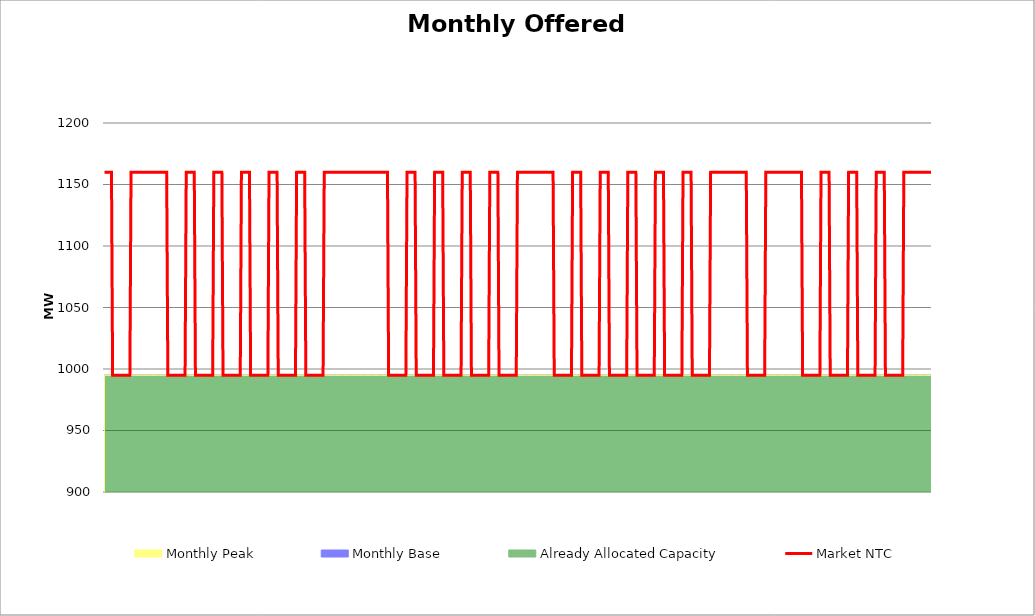
| Category | Market NTC |
|---|---|
| 0 | 1160 |
| 1 | 1160 |
| 2 | 1160 |
| 3 | 1160 |
| 4 | 1160 |
| 5 | 1160 |
| 6 | 1160 |
| 7 | 995 |
| 8 | 995 |
| 9 | 995 |
| 10 | 995 |
| 11 | 995 |
| 12 | 995 |
| 13 | 995 |
| 14 | 995 |
| 15 | 995 |
| 16 | 995 |
| 17 | 995 |
| 18 | 995 |
| 19 | 995 |
| 20 | 995 |
| 21 | 995 |
| 22 | 995 |
| 23 | 1160 |
| 24 | 1160 |
| 25 | 1160 |
| 26 | 1160 |
| 27 | 1160 |
| 28 | 1160 |
| 29 | 1160 |
| 30 | 1160 |
| 31 | 1160 |
| 32 | 1160 |
| 33 | 1160 |
| 34 | 1160 |
| 35 | 1160 |
| 36 | 1160 |
| 37 | 1160 |
| 38 | 1160 |
| 39 | 1160 |
| 40 | 1160 |
| 41 | 1160 |
| 42 | 1160 |
| 43 | 1160 |
| 44 | 1160 |
| 45 | 1160 |
| 46 | 1160 |
| 47 | 1160 |
| 48 | 1160 |
| 49 | 1160 |
| 50 | 1160 |
| 51 | 1160 |
| 52 | 1160 |
| 53 | 1160 |
| 54 | 1160 |
| 55 | 995 |
| 56 | 995 |
| 57 | 995 |
| 58 | 995 |
| 59 | 995 |
| 60 | 995 |
| 61 | 995 |
| 62 | 995 |
| 63 | 995 |
| 64 | 995 |
| 65 | 995 |
| 66 | 995 |
| 67 | 995 |
| 68 | 995 |
| 69 | 995 |
| 70 | 995 |
| 71 | 1160 |
| 72 | 1160 |
| 73 | 1160 |
| 74 | 1160 |
| 75 | 1160 |
| 76 | 1160 |
| 77 | 1160 |
| 78 | 1160 |
| 79 | 995 |
| 80 | 995 |
| 81 | 995 |
| 82 | 995 |
| 83 | 995 |
| 84 | 995 |
| 85 | 995 |
| 86 | 995 |
| 87 | 995 |
| 88 | 995 |
| 89 | 995 |
| 90 | 995 |
| 91 | 995 |
| 92 | 995 |
| 93 | 995 |
| 94 | 995 |
| 95 | 1160 |
| 96 | 1160 |
| 97 | 1160 |
| 98 | 1160 |
| 99 | 1160 |
| 100 | 1160 |
| 101 | 1160 |
| 102 | 1160 |
| 103 | 995 |
| 104 | 995 |
| 105 | 995 |
| 106 | 995 |
| 107 | 995 |
| 108 | 995 |
| 109 | 995 |
| 110 | 995 |
| 111 | 995 |
| 112 | 995 |
| 113 | 995 |
| 114 | 995 |
| 115 | 995 |
| 116 | 995 |
| 117 | 995 |
| 118 | 995 |
| 119 | 1160 |
| 120 | 1160 |
| 121 | 1160 |
| 122 | 1160 |
| 123 | 1160 |
| 124 | 1160 |
| 125 | 1160 |
| 126 | 1160 |
| 127 | 995 |
| 128 | 995 |
| 129 | 995 |
| 130 | 995 |
| 131 | 995 |
| 132 | 995 |
| 133 | 995 |
| 134 | 995 |
| 135 | 995 |
| 136 | 995 |
| 137 | 995 |
| 138 | 995 |
| 139 | 995 |
| 140 | 995 |
| 141 | 995 |
| 142 | 995 |
| 143 | 1160 |
| 144 | 1160 |
| 145 | 1160 |
| 146 | 1160 |
| 147 | 1160 |
| 148 | 1160 |
| 149 | 1160 |
| 150 | 1160 |
| 151 | 995 |
| 152 | 995 |
| 153 | 995 |
| 154 | 995 |
| 155 | 995 |
| 156 | 995 |
| 157 | 995 |
| 158 | 995 |
| 159 | 995 |
| 160 | 995 |
| 161 | 995 |
| 162 | 995 |
| 163 | 995 |
| 164 | 995 |
| 165 | 995 |
| 166 | 995 |
| 167 | 1160 |
| 168 | 1160 |
| 169 | 1160 |
| 170 | 1160 |
| 171 | 1160 |
| 172 | 1160 |
| 173 | 1160 |
| 174 | 1160 |
| 175 | 995 |
| 176 | 995 |
| 177 | 995 |
| 178 | 995 |
| 179 | 995 |
| 180 | 995 |
| 181 | 995 |
| 182 | 995 |
| 183 | 995 |
| 184 | 995 |
| 185 | 995 |
| 186 | 995 |
| 187 | 995 |
| 188 | 995 |
| 189 | 995 |
| 190 | 995 |
| 191 | 1160 |
| 192 | 1160 |
| 193 | 1160 |
| 194 | 1160 |
| 195 | 1160 |
| 196 | 1160 |
| 197 | 1160 |
| 198 | 1160 |
| 199 | 1160 |
| 200 | 1160 |
| 201 | 1160 |
| 202 | 1160 |
| 203 | 1160 |
| 204 | 1160 |
| 205 | 1160 |
| 206 | 1160 |
| 207 | 1160 |
| 208 | 1160 |
| 209 | 1160 |
| 210 | 1160 |
| 211 | 1160 |
| 212 | 1160 |
| 213 | 1160 |
| 214 | 1160 |
| 215 | 1160 |
| 216 | 1160 |
| 217 | 1160 |
| 218 | 1160 |
| 219 | 1160 |
| 220 | 1160 |
| 221 | 1160 |
| 222 | 1160 |
| 223 | 1160 |
| 224 | 1160 |
| 225 | 1160 |
| 226 | 1160 |
| 227 | 1160 |
| 228 | 1160 |
| 229 | 1160 |
| 230 | 1160 |
| 231 | 1160 |
| 232 | 1160 |
| 233 | 1160 |
| 234 | 1160 |
| 235 | 1160 |
| 236 | 1160 |
| 237 | 1160 |
| 238 | 1160 |
| 239 | 1160 |
| 240 | 1160 |
| 241 | 1160 |
| 242 | 1160 |
| 243 | 1160 |
| 244 | 1160 |
| 245 | 1160 |
| 246 | 1160 |
| 247 | 995 |
| 248 | 995 |
| 249 | 995 |
| 250 | 995 |
| 251 | 995 |
| 252 | 995 |
| 253 | 995 |
| 254 | 995 |
| 255 | 995 |
| 256 | 995 |
| 257 | 995 |
| 258 | 995 |
| 259 | 995 |
| 260 | 995 |
| 261 | 995 |
| 262 | 995 |
| 263 | 1160 |
| 264 | 1160 |
| 265 | 1160 |
| 266 | 1160 |
| 267 | 1160 |
| 268 | 1160 |
| 269 | 1160 |
| 270 | 1160 |
| 271 | 995 |
| 272 | 995 |
| 273 | 995 |
| 274 | 995 |
| 275 | 995 |
| 276 | 995 |
| 277 | 995 |
| 278 | 995 |
| 279 | 995 |
| 280 | 995 |
| 281 | 995 |
| 282 | 995 |
| 283 | 995 |
| 284 | 995 |
| 285 | 995 |
| 286 | 995 |
| 287 | 1160 |
| 288 | 1160 |
| 289 | 1160 |
| 290 | 1160 |
| 291 | 1160 |
| 292 | 1160 |
| 293 | 1160 |
| 294 | 1160 |
| 295 | 995 |
| 296 | 995 |
| 297 | 995 |
| 298 | 995 |
| 299 | 995 |
| 300 | 995 |
| 301 | 995 |
| 302 | 995 |
| 303 | 995 |
| 304 | 995 |
| 305 | 995 |
| 306 | 995 |
| 307 | 995 |
| 308 | 995 |
| 309 | 995 |
| 310 | 995 |
| 311 | 1160 |
| 312 | 1160 |
| 313 | 1160 |
| 314 | 1160 |
| 315 | 1160 |
| 316 | 1160 |
| 317 | 1160 |
| 318 | 1160 |
| 319 | 995 |
| 320 | 995 |
| 321 | 995 |
| 322 | 995 |
| 323 | 995 |
| 324 | 995 |
| 325 | 995 |
| 326 | 995 |
| 327 | 995 |
| 328 | 995 |
| 329 | 995 |
| 330 | 995 |
| 331 | 995 |
| 332 | 995 |
| 333 | 995 |
| 334 | 995 |
| 335 | 1160 |
| 336 | 1160 |
| 337 | 1160 |
| 338 | 1160 |
| 339 | 1160 |
| 340 | 1160 |
| 341 | 1160 |
| 342 | 1160 |
| 343 | 995 |
| 344 | 995 |
| 345 | 995 |
| 346 | 995 |
| 347 | 995 |
| 348 | 995 |
| 349 | 995 |
| 350 | 995 |
| 351 | 995 |
| 352 | 995 |
| 353 | 995 |
| 354 | 995 |
| 355 | 995 |
| 356 | 995 |
| 357 | 995 |
| 358 | 995 |
| 359 | 1160 |
| 360 | 1160 |
| 361 | 1160 |
| 362 | 1160 |
| 363 | 1160 |
| 364 | 1160 |
| 365 | 1160 |
| 366 | 1160 |
| 367 | 1160 |
| 368 | 1160 |
| 369 | 1160 |
| 370 | 1160 |
| 371 | 1160 |
| 372 | 1160 |
| 373 | 1160 |
| 374 | 1160 |
| 375 | 1160 |
| 376 | 1160 |
| 377 | 1160 |
| 378 | 1160 |
| 379 | 1160 |
| 380 | 1160 |
| 381 | 1160 |
| 382 | 1160 |
| 383 | 1160 |
| 384 | 1160 |
| 385 | 1160 |
| 386 | 1160 |
| 387 | 1160 |
| 388 | 1160 |
| 389 | 1160 |
| 390 | 1160 |
| 391 | 995 |
| 392 | 995 |
| 393 | 995 |
| 394 | 995 |
| 395 | 995 |
| 396 | 995 |
| 397 | 995 |
| 398 | 995 |
| 399 | 995 |
| 400 | 995 |
| 401 | 995 |
| 402 | 995 |
| 403 | 995 |
| 404 | 995 |
| 405 | 995 |
| 406 | 995 |
| 407 | 1160 |
| 408 | 1160 |
| 409 | 1160 |
| 410 | 1160 |
| 411 | 1160 |
| 412 | 1160 |
| 413 | 1160 |
| 414 | 1160 |
| 415 | 995 |
| 416 | 995 |
| 417 | 995 |
| 418 | 995 |
| 419 | 995 |
| 420 | 995 |
| 421 | 995 |
| 422 | 995 |
| 423 | 995 |
| 424 | 995 |
| 425 | 995 |
| 426 | 995 |
| 427 | 995 |
| 428 | 995 |
| 429 | 995 |
| 430 | 995 |
| 431 | 1160 |
| 432 | 1160 |
| 433 | 1160 |
| 434 | 1160 |
| 435 | 1160 |
| 436 | 1160 |
| 437 | 1160 |
| 438 | 1160 |
| 439 | 995 |
| 440 | 995 |
| 441 | 995 |
| 442 | 995 |
| 443 | 995 |
| 444 | 995 |
| 445 | 995 |
| 446 | 995 |
| 447 | 995 |
| 448 | 995 |
| 449 | 995 |
| 450 | 995 |
| 451 | 995 |
| 452 | 995 |
| 453 | 995 |
| 454 | 995 |
| 455 | 1160 |
| 456 | 1160 |
| 457 | 1160 |
| 458 | 1160 |
| 459 | 1160 |
| 460 | 1160 |
| 461 | 1160 |
| 462 | 1160 |
| 463 | 995 |
| 464 | 995 |
| 465 | 995 |
| 466 | 995 |
| 467 | 995 |
| 468 | 995 |
| 469 | 995 |
| 470 | 995 |
| 471 | 995 |
| 472 | 995 |
| 473 | 995 |
| 474 | 995 |
| 475 | 995 |
| 476 | 995 |
| 477 | 995 |
| 478 | 995 |
| 479 | 1160 |
| 480 | 1160 |
| 481 | 1160 |
| 482 | 1160 |
| 483 | 1160 |
| 484 | 1160 |
| 485 | 1160 |
| 486 | 1160 |
| 487 | 995 |
| 488 | 995 |
| 489 | 995 |
| 490 | 995 |
| 491 | 995 |
| 492 | 995 |
| 493 | 995 |
| 494 | 995 |
| 495 | 995 |
| 496 | 995 |
| 497 | 995 |
| 498 | 995 |
| 499 | 995 |
| 500 | 995 |
| 501 | 995 |
| 502 | 995 |
| 503 | 1160 |
| 504 | 1160 |
| 505 | 1160 |
| 506 | 1160 |
| 507 | 1160 |
| 508 | 1160 |
| 509 | 1160 |
| 510 | 1160 |
| 511 | 995 |
| 512 | 995 |
| 513 | 995 |
| 514 | 995 |
| 515 | 995 |
| 516 | 995 |
| 517 | 995 |
| 518 | 995 |
| 519 | 995 |
| 520 | 995 |
| 521 | 995 |
| 522 | 995 |
| 523 | 995 |
| 524 | 995 |
| 525 | 995 |
| 526 | 995 |
| 527 | 1160 |
| 528 | 1160 |
| 529 | 1160 |
| 530 | 1160 |
| 531 | 1160 |
| 532 | 1160 |
| 533 | 1160 |
| 534 | 1160 |
| 535 | 1160 |
| 536 | 1160 |
| 537 | 1160 |
| 538 | 1160 |
| 539 | 1160 |
| 540 | 1160 |
| 541 | 1160 |
| 542 | 1160 |
| 543 | 1160 |
| 544 | 1160 |
| 545 | 1160 |
| 546 | 1160 |
| 547 | 1160 |
| 548 | 1160 |
| 549 | 1160 |
| 550 | 1160 |
| 551 | 1160 |
| 552 | 1160 |
| 553 | 1160 |
| 554 | 1160 |
| 555 | 1160 |
| 556 | 1160 |
| 557 | 1160 |
| 558 | 1160 |
| 559 | 995 |
| 560 | 995 |
| 561 | 995 |
| 562 | 995 |
| 563 | 995 |
| 564 | 995 |
| 565 | 995 |
| 566 | 995 |
| 567 | 995 |
| 568 | 995 |
| 569 | 995 |
| 570 | 995 |
| 571 | 995 |
| 572 | 995 |
| 573 | 995 |
| 574 | 995 |
| 575 | 1160 |
| 576 | 1160 |
| 577 | 1160 |
| 578 | 1160 |
| 579 | 1160 |
| 580 | 1160 |
| 581 | 1160 |
| 582 | 1160 |
| 583 | 1160 |
| 584 | 1160 |
| 585 | 1160 |
| 586 | 1160 |
| 587 | 1160 |
| 588 | 1160 |
| 589 | 1160 |
| 590 | 1160 |
| 591 | 1160 |
| 592 | 1160 |
| 593 | 1160 |
| 594 | 1160 |
| 595 | 1160 |
| 596 | 1160 |
| 597 | 1160 |
| 598 | 1160 |
| 599 | 1160 |
| 600 | 1160 |
| 601 | 1160 |
| 602 | 1160 |
| 603 | 1160 |
| 604 | 1160 |
| 605 | 1160 |
| 606 | 1160 |
| 607 | 995 |
| 608 | 995 |
| 609 | 995 |
| 610 | 995 |
| 611 | 995 |
| 612 | 995 |
| 613 | 995 |
| 614 | 995 |
| 615 | 995 |
| 616 | 995 |
| 617 | 995 |
| 618 | 995 |
| 619 | 995 |
| 620 | 995 |
| 621 | 995 |
| 622 | 995 |
| 623 | 1160 |
| 624 | 1160 |
| 625 | 1160 |
| 626 | 1160 |
| 627 | 1160 |
| 628 | 1160 |
| 629 | 1160 |
| 630 | 1160 |
| 631 | 995 |
| 632 | 995 |
| 633 | 995 |
| 634 | 995 |
| 635 | 995 |
| 636 | 995 |
| 637 | 995 |
| 638 | 995 |
| 639 | 995 |
| 640 | 995 |
| 641 | 995 |
| 642 | 995 |
| 643 | 995 |
| 644 | 995 |
| 645 | 995 |
| 646 | 995 |
| 647 | 1160 |
| 648 | 1160 |
| 649 | 1160 |
| 650 | 1160 |
| 651 | 1160 |
| 652 | 1160 |
| 653 | 1160 |
| 654 | 1160 |
| 655 | 995 |
| 656 | 995 |
| 657 | 995 |
| 658 | 995 |
| 659 | 995 |
| 660 | 995 |
| 661 | 995 |
| 662 | 995 |
| 663 | 995 |
| 664 | 995 |
| 665 | 995 |
| 666 | 995 |
| 667 | 995 |
| 668 | 995 |
| 669 | 995 |
| 670 | 995 |
| 671 | 1160 |
| 672 | 1160 |
| 673 | 1160 |
| 674 | 1160 |
| 675 | 1160 |
| 676 | 1160 |
| 677 | 1160 |
| 678 | 1160 |
| 679 | 995 |
| 680 | 995 |
| 681 | 995 |
| 682 | 995 |
| 683 | 995 |
| 684 | 995 |
| 685 | 995 |
| 686 | 995 |
| 687 | 995 |
| 688 | 995 |
| 689 | 995 |
| 690 | 995 |
| 691 | 995 |
| 692 | 995 |
| 693 | 995 |
| 694 | 995 |
| 695 | 1160 |
| 696 | 1160 |
| 697 | 1160 |
| 698 | 1160 |
| 699 | 1160 |
| 700 | 1160 |
| 701 | 1160 |
| 702 | 1160 |
| 703 | 1160 |
| 704 | 1160 |
| 705 | 1160 |
| 706 | 1160 |
| 707 | 1160 |
| 708 | 1160 |
| 709 | 1160 |
| 710 | 1160 |
| 711 | 1160 |
| 712 | 1160 |
| 713 | 1160 |
| 714 | 1160 |
| 715 | 1160 |
| 716 | 1160 |
| 717 | 1160 |
| 718 | 1160 |
| 719 | 1160 |